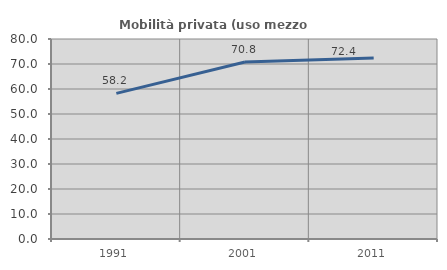
| Category | Mobilità privata (uso mezzo privato) |
|---|---|
| 1991.0 | 58.249 |
| 2001.0 | 70.775 |
| 2011.0 | 72.369 |